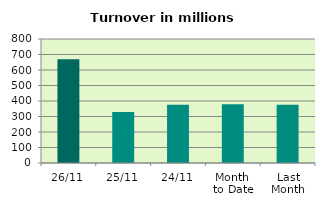
| Category | Series 0 |
|---|---|
| 26/11 | 669.126 |
| 25/11 | 329.087 |
| 24/11 | 376.604 |
| Month 
to Date | 379.48 |
| Last
Month | 375.959 |